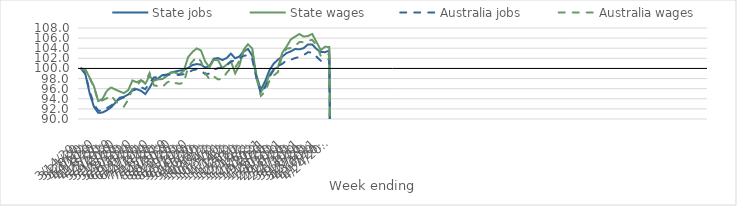
| Category | State jobs | State wages | Australia jobs | Australia wages |
|---|---|---|---|---|
| 14/03/2020 | 100 | 100 | 100 | 100 |
| 21/03/2020 | 98.844 | 99.799 | 98.971 | 99.607 |
| 28/03/2020 | 95.027 | 98.155 | 95.468 | 98.119 |
| 04/04/2020 | 92.407 | 96.429 | 92.921 | 96.261 |
| 11/04/2020 | 91.21 | 93.532 | 91.648 | 93.491 |
| 18/04/2020 | 91.29 | 93.984 | 91.631 | 93.695 |
| 25/04/2020 | 91.716 | 95.581 | 92.161 | 94.112 |
| 02/05/2020 | 92.309 | 96.265 | 92.658 | 94.685 |
| 09/05/2020 | 93.213 | 95.819 | 93.342 | 93.574 |
| 16/05/2020 | 94.205 | 95.454 | 93.935 | 92.809 |
| 23/05/2020 | 94.403 | 95.114 | 94.29 | 92.465 |
| 30/05/2020 | 94.833 | 95.702 | 94.796 | 93.818 |
| 06/06/2020 | 95.618 | 97.624 | 95.779 | 95.924 |
| 13/06/2020 | 95.91 | 97.263 | 96.278 | 96.597 |
| 20/06/2020 | 95.57 | 97.704 | 96.293 | 97.571 |
| 27/06/2020 | 94.924 | 96.979 | 95.898 | 97.324 |
| 04/07/2020 | 96.179 | 98.514 | 97.132 | 99.089 |
| 11/07/2020 | 97.724 | 97.552 | 98.221 | 96.668 |
| 18/07/2020 | 98.044 | 97.857 | 98.324 | 96.5 |
| 25/07/2020 | 98.695 | 97.898 | 98.548 | 96.312 |
| 01/08/2020 | 98.752 | 98.488 | 98.77 | 97.181 |
| 08/08/2020 | 99.146 | 99.253 | 98.766 | 97.601 |
| 15/08/2020 | 99.401 | 99.168 | 98.672 | 97.108 |
| 22/08/2020 | 99.57 | 98.861 | 98.73 | 96.964 |
| 29/08/2020 | 99.701 | 99.52 | 98.866 | 97.198 |
| 05/09/2020 | 100.112 | 102.236 | 99.166 | 100.215 |
| 12/09/2020 | 100.669 | 103.242 | 99.638 | 101.349 |
| 19/09/2020 | 100.865 | 103.959 | 99.835 | 102.253 |
| 26/09/2020 | 100.752 | 103.568 | 99.64 | 101.42 |
| 03/10/2020 | 100.177 | 101.37 | 98.855 | 99.138 |
| 10/10/2020 | 100.476 | 100.242 | 98.997 | 97.834 |
| 17/10/2020 | 101.931 | 101.702 | 99.767 | 98.431 |
| 24/10/2020 | 102.053 | 101.619 | 100.05 | 97.835 |
| 31/10/2020 | 101.66 | 100.089 | 100.228 | 97.89 |
| 07/11/2020 | 102.05 | 100.741 | 100.597 | 99.112 |
| 14/11/2020 | 102.928 | 101.439 | 101.334 | 100.12 |
| 21/11/2020 | 102.003 | 99.026 | 101.652 | 100.166 |
| 28/11/2020 | 102.375 | 100.626 | 101.968 | 101.522 |
| 05/12/2020 | 103.458 | 103.732 | 102.515 | 103.324 |
| 12/12/2020 | 103.85 | 104.787 | 102.583 | 103.755 |
| 19/12/2020 | 102.478 | 103.934 | 101.771 | 103.629 |
| 26/12/2020 | 98.51 | 98.048 | 97.972 | 98.159 |
| 02/01/2021 | 95.771 | 95.34 | 95.021 | 94.58 |
| 09/01/2021 | 97.463 | 96.548 | 96.246 | 95.443 |
| 16/01/2021 | 99.638 | 98.736 | 98.354 | 97.531 |
| 23/01/2021 | 100.953 | 99.855 | 99.666 | 98.597 |
| 30/01/2021 | 101.751 | 100.251 | 100.48 | 99.293 |
| 06/02/2021 | 102.35 | 103.098 | 100.907 | 102.696 |
| 13/02/2021 | 103.032 | 104.301 | 101.592 | 103.915 |
| 20/02/2021 | 103.377 | 105.746 | 101.718 | 104.04 |
| 27/02/2021 | 103.845 | 106.282 | 102.048 | 104.48 |
| 06/03/2021 | 103.781 | 106.812 | 102.273 | 105.217 |
| 13/03/2021 | 104.007 | 106.304 | 102.625 | 105.198 |
| 20/03/2021 | 104.754 | 106.41 | 103.203 | 105.516 |
| 27/03/2021 | 104.752 | 106.818 | 103.136 | 105.634 |
| 03/04/2021 | 103.835 | 105.234 | 102.34 | 104.641 |
| 10/04/2021 | 103.262 | 103.635 | 101.508 | 102.484 |
| 17/04/2021 | 103.216 | 104.296 | 101.424 | 102.692 |
| 24/04/2021 | 103.552 | 104.231 | 101.89 | 102.787 |